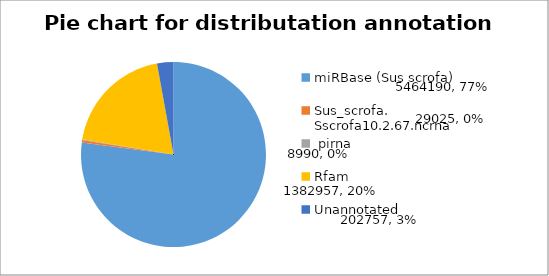
| Category | Series 0 |
|---|---|
| miRBase (Sus scrofa) | 5464190 |
| Sus_scrofa. Sscrofa10.2.67.ncrna | 29025 |
|  pirna | 8990 |
| Rfam | 1382957 |
| Unannotated  | 202757 |